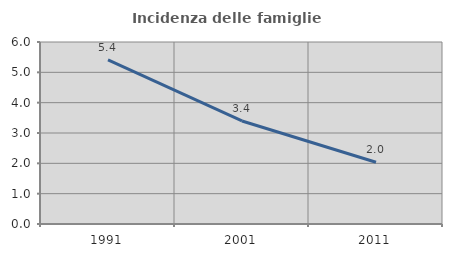
| Category | Incidenza delle famiglie numerose |
|---|---|
| 1991.0 | 5.409 |
| 2001.0 | 3.398 |
| 2011.0 | 2.037 |